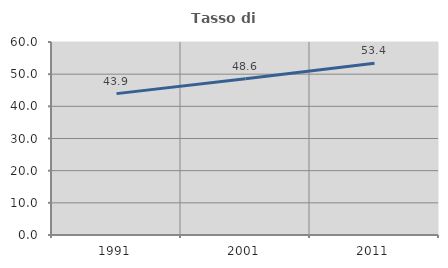
| Category | Tasso di occupazione   |
|---|---|
| 1991.0 | 43.949 |
| 2001.0 | 48.588 |
| 2011.0 | 53.365 |